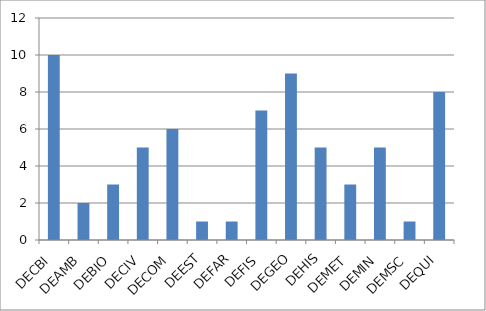
| Category | Series 0 |
|---|---|
| DECBI | 10 |
| DEAMB | 2 |
| DEBIO | 3 |
| DECIV | 5 |
| DECOM | 6 |
| DEEST | 1 |
| DEFAR | 1 |
| DEFIS | 7 |
| DEGEO | 9 |
| DEHIS | 5 |
| DEMET | 3 |
| DEMIN | 5 |
| DEMSC | 1 |
| DEQUI | 8 |